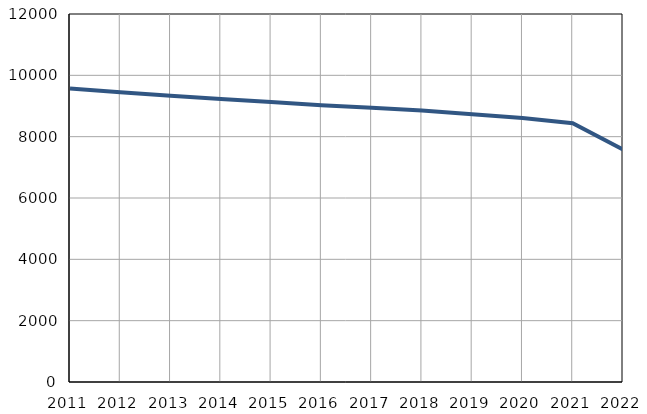
| Category | Број
становника |
|---|---|
| 2011.0 | 9574 |
| 2012.0 | 9452 |
| 2013.0 | 9333 |
| 2014.0 | 9225 |
| 2015.0 | 9130 |
| 2016.0 | 9025 |
| 2017.0 | 8941 |
| 2018.0 | 8851 |
| 2019.0 | 8732 |
| 2020.0 | 8608 |
| 2021.0 | 8440 |
| 2022.0 | 7577 |